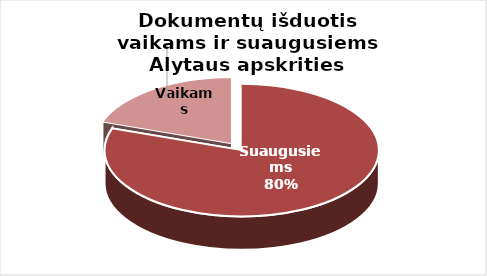
| Category | Series 0 |
|---|---|
| Suaugusiems | 984762 |
| Vaikams | 241078 |